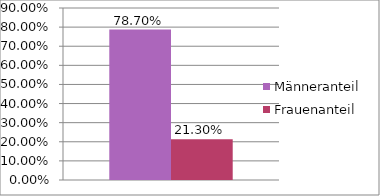
| Category | Männeranteil | Frauenanteil |
|---|---|---|
| 0 | 0.787 | 0.213 |